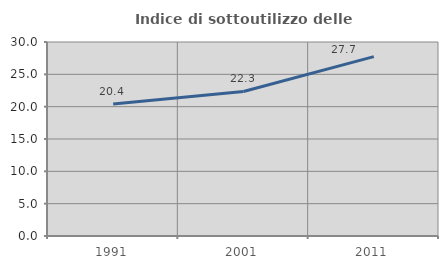
| Category | Indice di sottoutilizzo delle abitazioni  |
|---|---|
| 1991.0 | 20.406 |
| 2001.0 | 22.349 |
| 2011.0 | 27.735 |